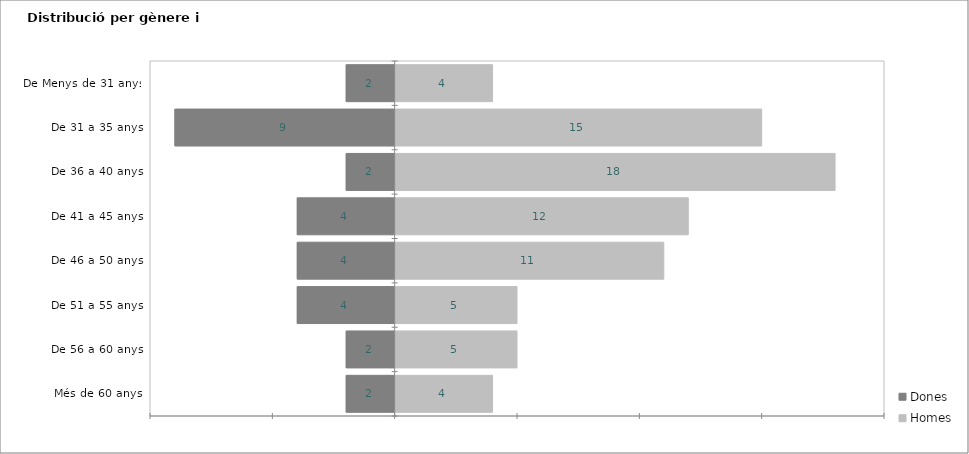
| Category | Dones | Homes |
|---|---|---|
| Més de 60 anys | -2 | 4 |
| De 56 a 60 anys | -2 | 5 |
| De 51 a 55 anys | -4 | 5 |
| De 46 a 50 anys | -4 | 11 |
| De 41 a 45 anys | -4 | 12 |
| De 36 a 40 anys | -2 | 18 |
| De 31 a 35 anys | -9 | 15 |
| De Menys de 31 anys | -2 | 4 |